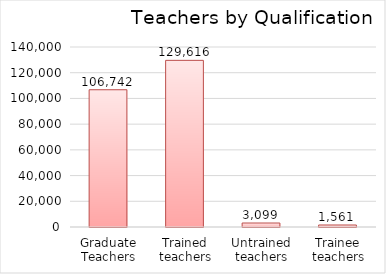
| Category | Series 0 |
|---|---|
| Graduate Teachers | 106742 |
| Trained teachers | 129616 |
| Untrained teachers | 3099 |
| Trainee teachers | 1561 |